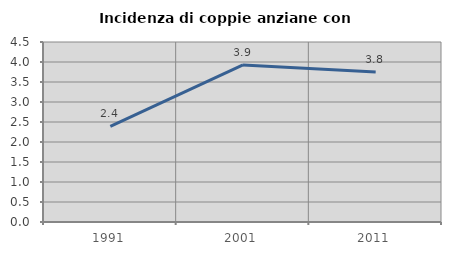
| Category | Incidenza di coppie anziane con figli |
|---|---|
| 1991.0 | 2.392 |
| 2001.0 | 3.925 |
| 2011.0 | 3.752 |